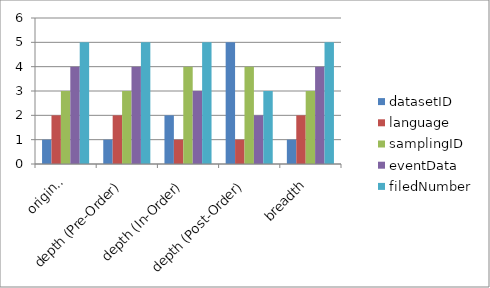
| Category | datasetID | language | samplingID | eventData | filedNumber |
|---|---|---|---|---|---|
| original | 1 | 2 | 3 | 4 | 5 |
| depth (Pre-Order) | 1 | 2 | 3 | 4 | 5 |
| depth (In-Order) | 2 | 1 | 4 | 3 | 5 |
| depth (Post-Order) | 5 | 1 | 4 | 2 | 3 |
| breadth | 1 | 2 | 3 | 4 | 5 |